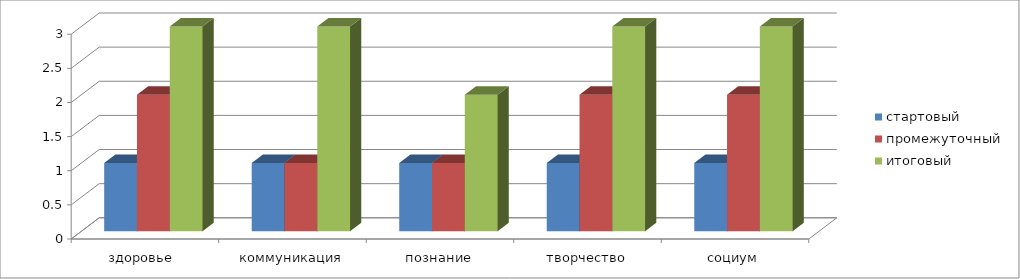
| Category | стартовый | промежуточный | итоговый |
|---|---|---|---|
| здоровье  | 1 | 2 | 3 |
| коммуникация | 1 | 1 | 3 |
| познание | 1 | 1 | 2 |
| творчество | 1 | 2 | 3 |
| социум | 1 | 2 | 3 |